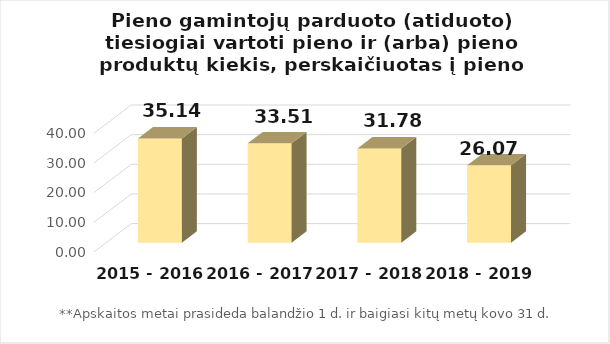
| Category | Pieno gamintojų parduoto (atiduoto) tiesiogiai vartoti pieno ir (arba) pieno produktų kiekis, perskaičiuotas į pieno ekvivalentą (tūkst. t) |
|---|---|
| 2015 - 2016 m.** | 35.143 |
| 2016 - 2017 m.** | 33.51 |
| 2017 - 2018 m.** | 31.783 |
| 2018 - 2019 m.** | 26.075 |